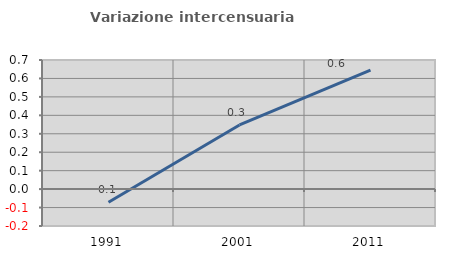
| Category | Variazione intercensuaria annua |
|---|---|
| 1991.0 | -0.071 |
| 2001.0 | 0.348 |
| 2011.0 | 0.645 |